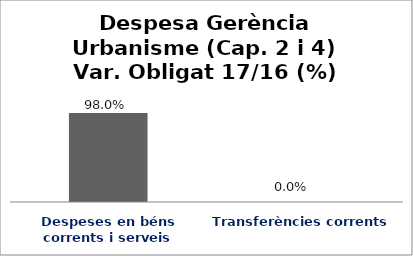
| Category | Series 0 |
|---|---|
| Despeses en béns corrents i serveis | 0.98 |
| Transferències corrents | 0 |